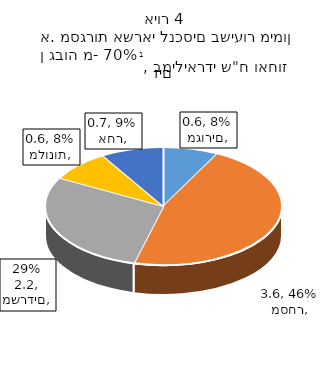
| Category | Series 0 |
|---|---|
| מגורים | 0.58 |
| מסחר | 3.551 |
| משרדים | 2.212 |
| מלונות | 0.647 |
| אחר | 0.655 |